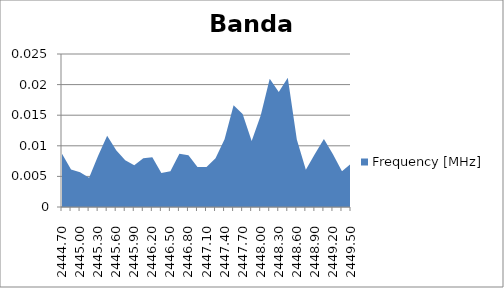
| Category | Frequency [MHz] |
|---|---|
| 2444.7 | 0.009 |
| 2444.85 | 0.006 |
| 2445.0 | 0.006 |
| 2445.15 | 0.005 |
| 2445.3 | 0.008 |
| 2445.45 | 0.012 |
| 2445.6 | 0.009 |
| 2445.75 | 0.008 |
| 2445.9 | 0.007 |
| 2446.05 | 0.008 |
| 2446.2 | 0.008 |
| 2446.35 | 0.006 |
| 2446.5 | 0.006 |
| 2446.65 | 0.009 |
| 2446.8 | 0.008 |
| 2446.95 | 0.007 |
| 2447.1 | 0.007 |
| 2447.25 | 0.008 |
| 2447.4 | 0.011 |
| 2447.55 | 0.017 |
| 2447.7 | 0.015 |
| 2447.85 | 0.011 |
| 2448.0 | 0.015 |
| 2448.15 | 0.021 |
| 2448.3 | 0.019 |
| 2448.45 | 0.021 |
| 2448.6 | 0.011 |
| 2448.75 | 0.006 |
| 2448.9 | 0.009 |
| 2449.05 | 0.011 |
| 2449.2 | 0.009 |
| 2449.35 | 0.006 |
| 2449.5 | 0.007 |